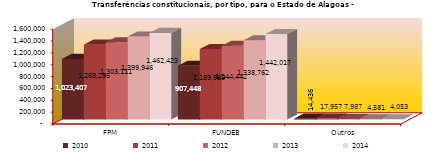
| Category | 2010 | 2011 | 2012 | 2013 | 2014 |
|---|---|---|---|---|---|
| FPM | 1023407 | 1263295 | 1303111 | 1399946 | 1462423.04 |
| FUNDEB | 907448 | 1189989 | 1244442 | 1338762 | 1442017.169 |
| Outros | 14436 | 17957 | 7987 | 4581 | 4052.877 |